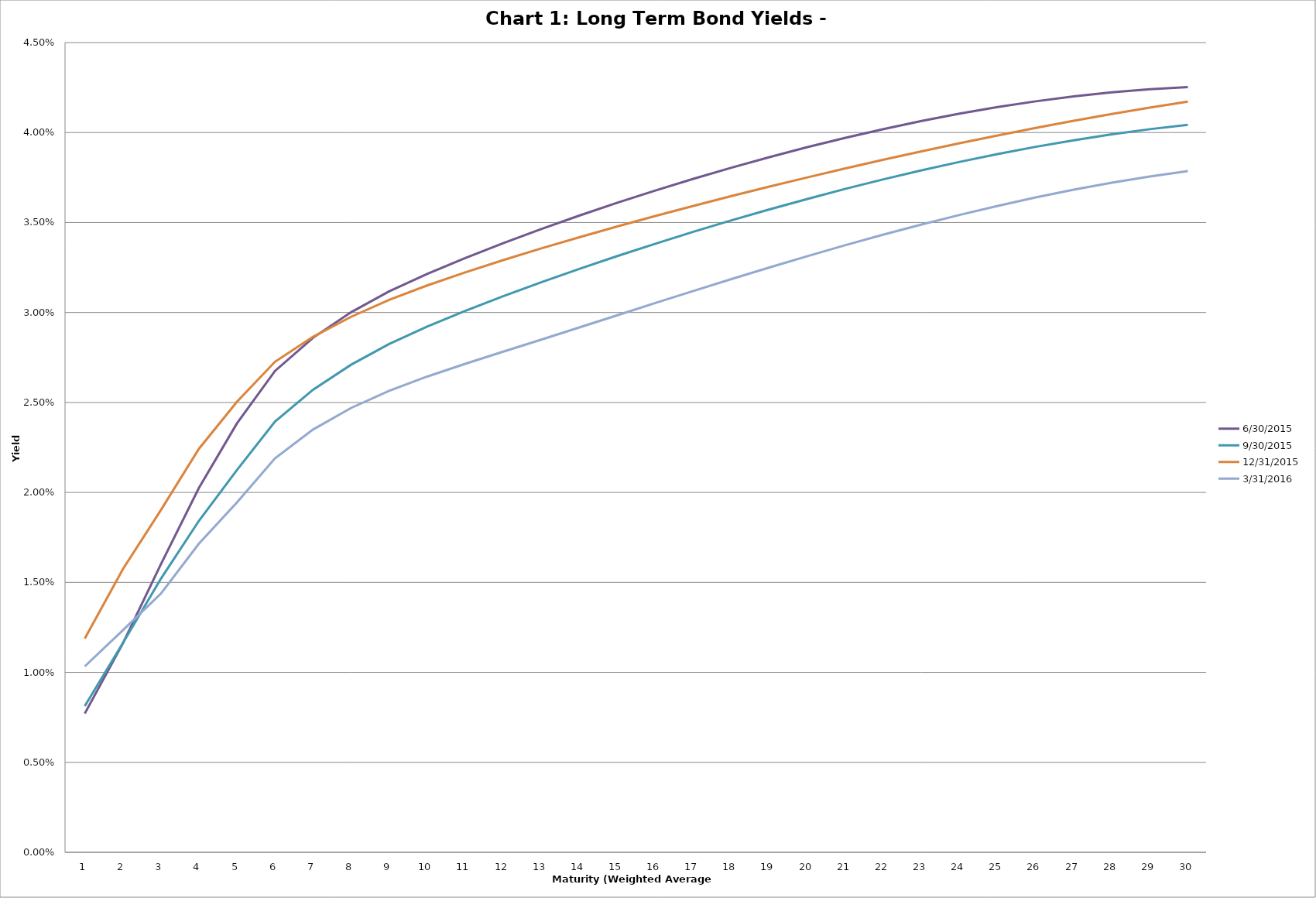
| Category | 6/30/2015 | 9/30/2015 | 12/31/2015 | 3/31/2016 |
|---|---|---|---|---|
| 0 | 0.008 | 0.008 | 0.012 | 0.01 |
| 1 | 0.012 | 0.012 | 0.016 | 0.012 |
| 2 | 0.016 | 0.015 | 0.019 | 0.014 |
| 3 | 0.02 | 0.018 | 0.022 | 0.017 |
| 4 | 0.024 | 0.021 | 0.025 | 0.019 |
| 5 | 0.027 | 0.024 | 0.027 | 0.022 |
| 6 | 0.029 | 0.026 | 0.029 | 0.023 |
| 7 | 0.03 | 0.027 | 0.03 | 0.025 |
| 8 | 0.031 | 0.028 | 0.031 | 0.026 |
| 9 | 0.032 | 0.029 | 0.032 | 0.026 |
| 10 | 0.033 | 0.03 | 0.032 | 0.027 |
| 11 | 0.034 | 0.031 | 0.033 | 0.028 |
| 12 | 0.035 | 0.032 | 0.034 | 0.028 |
| 13 | 0.035 | 0.032 | 0.034 | 0.029 |
| 14 | 0.036 | 0.033 | 0.035 | 0.03 |
| 15 | 0.037 | 0.034 | 0.035 | 0.031 |
| 16 | 0.037 | 0.034 | 0.036 | 0.031 |
| 17 | 0.038 | 0.035 | 0.036 | 0.032 |
| 18 | 0.039 | 0.036 | 0.037 | 0.033 |
| 19 | 0.039 | 0.036 | 0.038 | 0.033 |
| 20 | 0.04 | 0.037 | 0.038 | 0.034 |
| 21 | 0.04 | 0.037 | 0.038 | 0.034 |
| 22 | 0.041 | 0.038 | 0.039 | 0.035 |
| 23 | 0.041 | 0.038 | 0.039 | 0.035 |
| 24 | 0.041 | 0.039 | 0.04 | 0.036 |
| 25 | 0.042 | 0.039 | 0.04 | 0.036 |
| 26 | 0.042 | 0.04 | 0.041 | 0.037 |
| 27 | 0.042 | 0.04 | 0.041 | 0.037 |
| 28 | 0.042 | 0.04 | 0.041 | 0.038 |
| 29 | 0.043 | 0.04 | 0.042 | 0.038 |